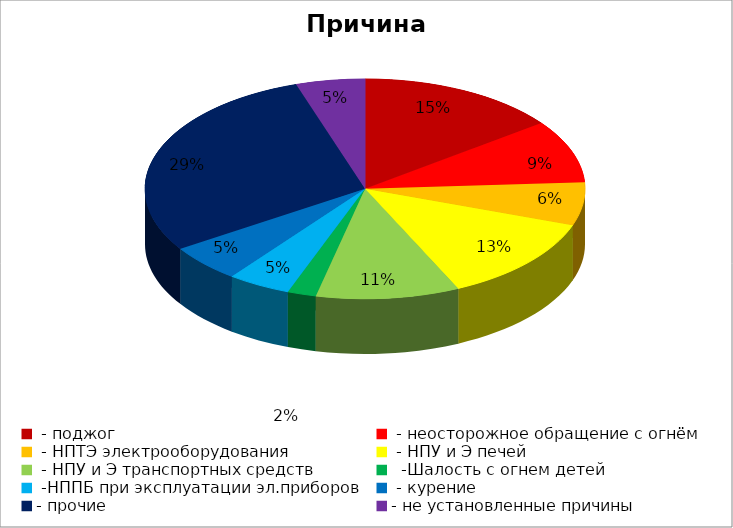
| Category | Причина пожара |
|---|---|
|  - поджог | 35 |
|  - неосторожное обращение с огнём | 22 |
|  - НПТЭ электрооборудования | 15 |
|  - НПУ и Э печей | 30 |
|  - НПУ и Э транспортных средств | 25 |
|   -Шалость с огнем детей | 5 |
|  -НППБ при эксплуатации эл.приборов | 11 |
|  - курение | 13 |
| - прочие | 69 |
| - не установленные причины | 12 |